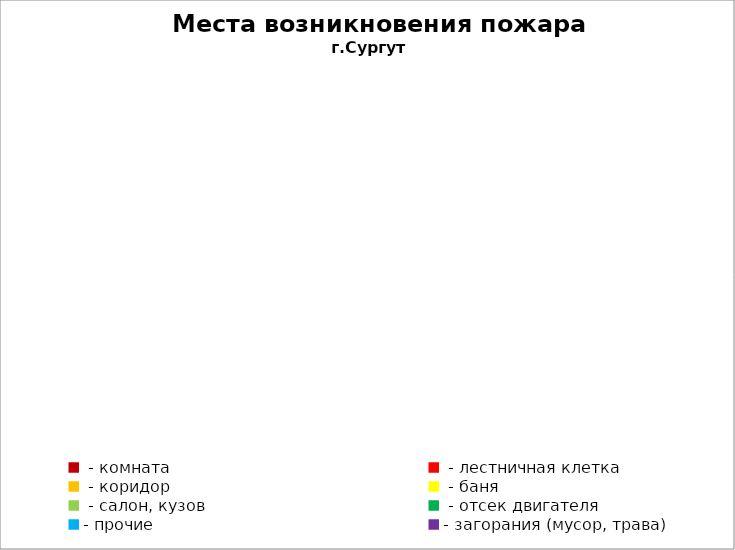
| Category | Места возникновения пожара |
|---|---|
|  - комната | 74 |
|  - лестничная клетка | 11 |
|  - коридор | 7 |
|  - баня | 42 |
|  - салон, кузов | 18 |
|  - отсек двигателя | 47 |
| - прочие | 134 |
| - загорания (мусор, трава)  | 129 |